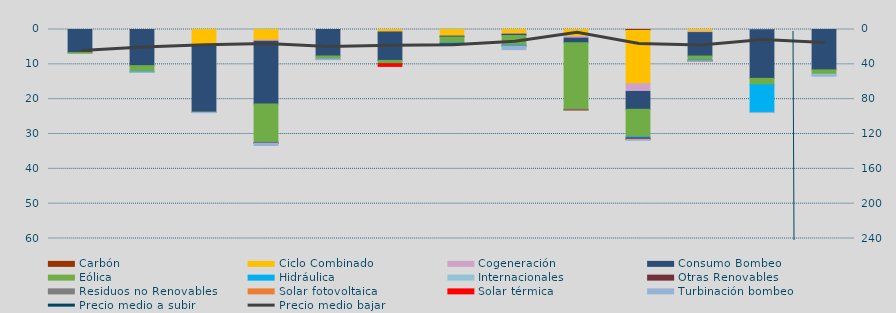
| Category | Carbón | Ciclo Combinado | Cogeneración | Consumo Bombeo | Enlace Península Baleares | Eólica | Hidráulica | Internacionales | Otras Renovables | Residuos no Renovables | Solar fotovoltaica | Solar térmica | Turbinación bombeo |
|---|---|---|---|---|---|---|---|---|---|---|---|---|---|
| 0 | 0 | 0 | 0 | 6628.9 |  | 183.2 | 0 | 0 | 0 | 0 | 0 | 0 | 0 |
| 1 | 0 | 1.3 | 0 | 10386.9 |  | 1741.8 | 75 | 0 | 0 | 0 | 0 | 0 | 139.3 |
| 2 | 0 | 4765.8 | 1.3 | 18991.8 |  | 4.2 | 0 | 0 | 0 | 0 | 0 | 0 | 118 |
| 3 | 0 | 3050.9 | 350.1 | 17978.8 |  | 10989.6 | 66.4 | 80 | 170.8 | 0 | 2.7 | 0 | 614.9 |
| 4 | 0 | 0 | 0 | 7614.5 |  | 781.3 | 105.7 | 0 | 0 | 0 | 2.1 | 0 | 181 |
| 5 | 0 | 720.2 | 1.2 | 8158 |  | 874.3 | 55.9 | 0 | 0 | 0 | 0 | 782.4 | 0 |
| 6 | 0 | 1851.6 | 42.3 | 273.4 |  | 1634.9 | 310 | 0 | 3.7 | 0 | 0 | 0 | 0 |
| 7 | 0 | 1244.2 | 103.6 | 370.8 |  | 2746.7 | 304.8 | 0 | 15.4 | 0 | 0.1 | 0 | 1000.2 |
| 8 | 0 | 2003.8 | 480.6 | 1308.7 |  | 19069.4 | 129.7 | 0 | 113.5 | 0 | 2 | 0 | 0 |
| 9 | 274.3 | 15310.9 | 2199.5 | 5123.2 |  | 7894.3 | 324.4 | 0 | 365.6 | 0 | 33.3 | 39.3 | 259.1 |
| 10 | 0 | 600 | 290.9 | 6727.7 |  | 1121.1 | 272.6 | 0 | 7.6 | 12.5 | 0.4 | 0 | 84 |
| 11 | 0 | 0 | 66 | 13968.1 |  | 1844.7 | 7917.4 | 0 | 0 | 0 | 0 | 0 | 46.9 |
| 12 | 0 | 0 | 13.8 | 11574.5 |  | 1255.7 | 0 | 313 | 0 | 0 | 0 | 0 | 240.1 |